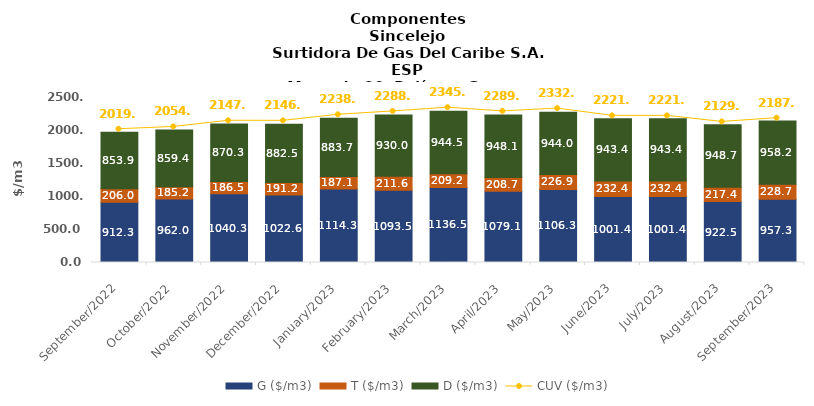
| Category | G ($/m3) | T ($/m3) | D ($/m3) |
|---|---|---|---|
| 2022-09-01 | 912.26 | 206.01 | 853.9 |
| 2022-10-01 | 962.02 | 185.17 | 859.36 |
| 2022-11-01 | 1040.34 | 186.54 | 870.26 |
| 2022-12-01 | 1022.62 | 191.17 | 882.47 |
| 2023-01-01 | 1114.3 | 187.05 | 883.66 |
| 2023-02-01 | 1093.5 | 211.55 | 930.03 |
| 2023-03-01 | 1136.5 | 209.16 | 944.52 |
| 2023-04-01 | 1079.14 | 208.7 | 948.13 |
| 2023-05-01 | 1106.33 | 226.94 | 944.03 |
| 2023-06-01 | 1001.4 | 232.37 | 943.37 |
| 2023-07-01 | 1001.4 | 232.37 | 943.37 |
| 2023-08-01 | 922.47 | 217.36 | 948.72 |
| 2023-09-01 | 957.29 | 228.69 | 958.18 |